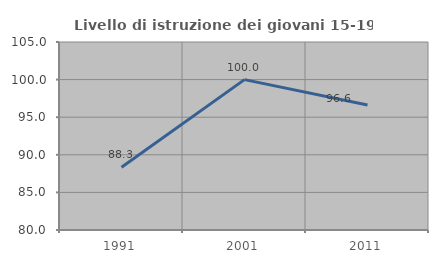
| Category | Livello di istruzione dei giovani 15-19 anni |
|---|---|
| 1991.0 | 88.333 |
| 2001.0 | 100 |
| 2011.0 | 96.61 |